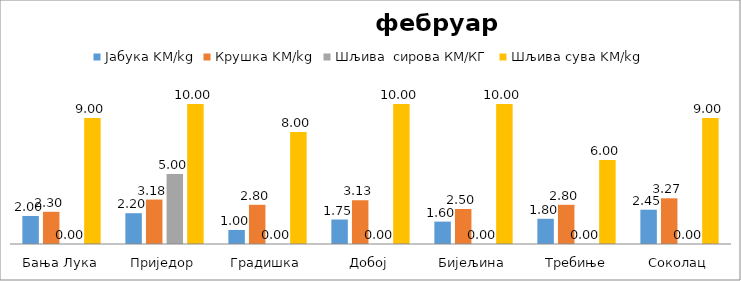
| Category | Јабука KM/kg | Крушка KM/kg | Шљива  сирова КМ/КГ | Шљива сува KM/kg |
|---|---|---|---|---|
| Бања Лука | 2 | 2.3 | 0 | 9 |
| Приједор | 2.2 | 3.175 | 5 | 10 |
| Градишка | 1 | 2.8 | 0 | 8 |
| Добој | 1.75 | 3.125 | 0 | 10 |
| Бијељина | 1.6 | 2.5 | 0 | 10 |
|  Требиње | 1.8 | 2.8 | 0 | 6 |
| Соколац | 2.45 | 3.265 | 0 | 9 |